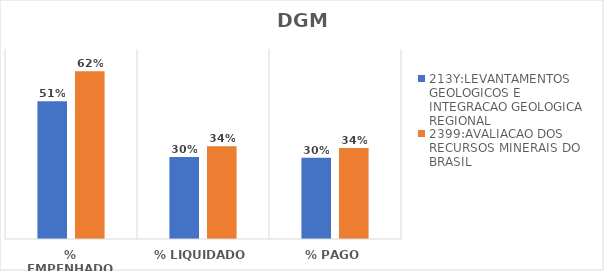
| Category | 213Y:LEVANTAMENTOS GEOLOGICOS E INTEGRACAO GEOLOGICA REGIONAL | 2399:AVALIACAO DOS RECURSOS MINERAIS DO BRASIL |
|---|---|---|
| % EMPENHADO | 0.508 | 0.618 |
| % LIQUIDADO | 0.302 | 0.342 |
| % PAGO | 0.299 | 0.336 |